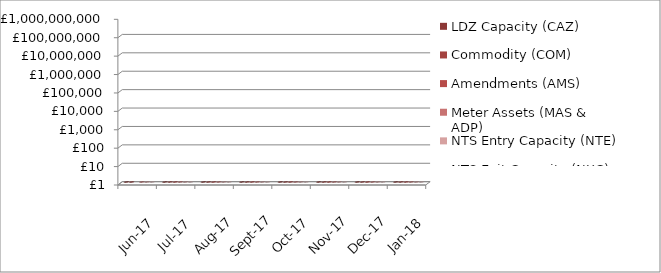
| Category | LDZ Capacity (CAZ) | Commodity (COM) | Amendments (AMS) | Meter Assets (MAS & ADP) | NTS Entry Capacity (NTE) | NTS Exit Capacity (NXC) |
|---|---|---|---|---|---|---|
| 2017-06-01 | 288773735.37 | 16487569.55 | -3258688.63 | 187370.3 | 2007422.43 | 22701563.13 |
| 2017-07-01 | 298593731.84 | 16897919.7 | 247176.37 | 193814.49 | 1970532.91 | 23462413.06 |
| 2017-08-01 | 298862406.46 | 16761360.58 | 1357290.74 | 193840.59 | 1969937.93 | 23465025.38 |
| 2017-09-01 | 289415948.74 | 20098400.73 | 205300.25 | 187587.95 | 1855267.92 | 22811559.53 |
| 2017-10-01 | 299201864.14 | 26855499.51 | 321543.98 | 193840.32 | 11176717.5 | 18097117.82 |
| 2017-11-01 | 290194555.87 | 41901625.24 | 281193.04 | 187587.95 | 12089719.21 | 18734838.83 |
| 2017-12-01 | 299923728.54 | 49314715.49 | 486751.91 | 193840.34 | 12089719.21 | 18734838.83 |
| 2018-01-01 | 300085873.04 | 51013861.41 | 398601 | 193840 | 13468961.26 | 18693319.21 |